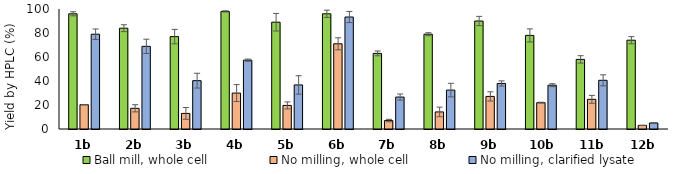
| Category | Ball mill, whole cell | No milling, whole cell | No milling, clarified lysate |
|---|---|---|---|
| 1b | 96 | 20.245 | 78.999 |
| 2b | 84 | 17.235 | 68.876 |
| 3b | 77 | 12.992 | 40.274 |
| 4b | 98 | 29.933 | 57.366 |
| 5b | 89 | 19.637 | 36.725 |
| 6b | 96 | 71 | 93.333 |
| 7b | 63 | 7.015 | 26.624 |
| 8b | 79 | 14.228 | 32.43 |
| 9b | 90 | 27.157 | 37.956 |
| 10b | 78 | 21.95 | 36.499 |
| 11b | 58 | 24.721 | 40.577 |
| 12b | 74 | 3 | 5 |